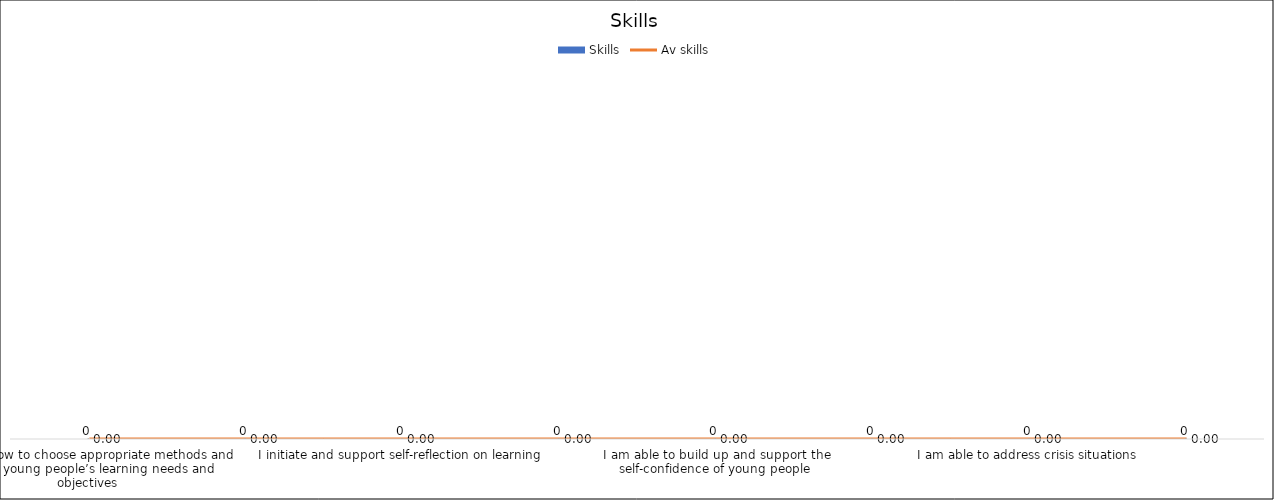
| Category | Skills |
|---|---|
| I know how to choose appropriate methods and assess young people’s learning needs and objectives | 0 |
| I know how to identify, organise and refer to appropriate resources to support my own learning | 0 |
| I initiate and support self-reflection on learning | 0 |
| I know how to identify dimensions and stages in group processes | 0 |
| I am able to build up and support the self-confidence of young people | 0 |
| I empathise in a way that others can learn from my experience | 0 |
| I am able to address crisis situations | 0 |
| I enable individual and/or group reflection on ethical issues | 0 |